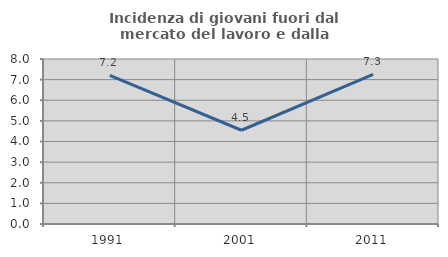
| Category | Incidenza di giovani fuori dal mercato del lavoro e dalla formazione  |
|---|---|
| 1991.0 | 7.202 |
| 2001.0 | 4.545 |
| 2011.0 | 7.25 |